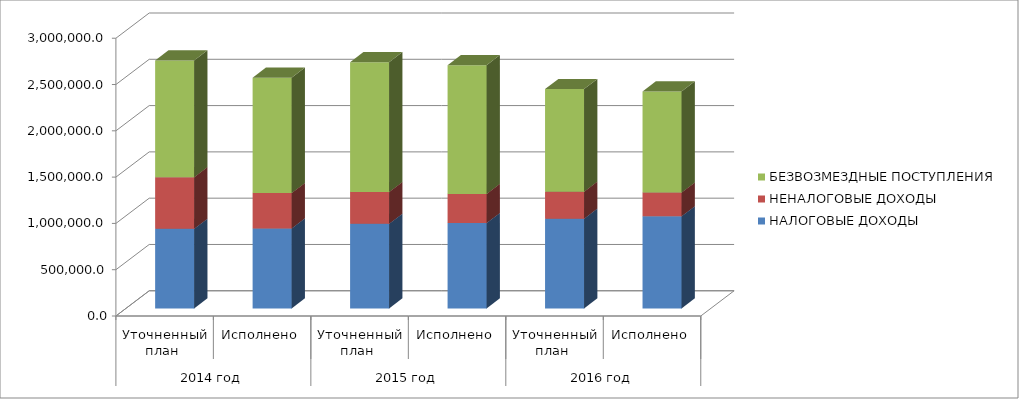
| Category | НАЛОГОВЫЕ ДОХОДЫ | НЕНАЛОГОВЫЕ ДОХОДЫ | БЕЗВОЗМЕЗДНЫЕ ПОСТУПЛЕНИЯ |
|---|---|---|---|
| 0 | 860067.8 | 557741.1 | 1260482.7 |
| 1 | 864043.8 | 382526.9 | 1245276.4 |
| 2 | 913508.6 | 342687.3 | 1403691.7 |
| 3 | 921517.2 | 315602.5 | 1390009.2 |
| 4 | 969582.4 | 291219.1 | 1108978.8 |
| 5 | 994890.9 | 257420.4 | 1091941.9 |